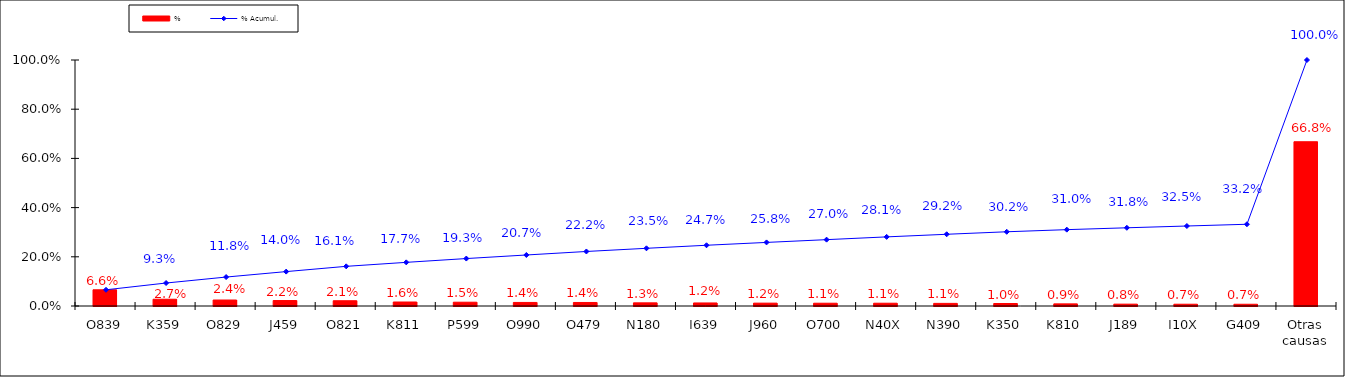
| Category | % |
|---|---|
| O839 | 0.066 |
| K359 | 0.027 |
| O829 | 0.024 |
| J459 | 0.022 |
| O821 | 0.021 |
| K811 | 0.016 |
| P599 | 0.015 |
| O990 | 0.014 |
| O479 | 0.014 |
| N180 | 0.013 |
| I639 | 0.012 |
| J960 | 0.012 |
| O700 | 0.011 |
| N40X | 0.011 |
| N390 | 0.011 |
| K350 | 0.01 |
| K810 | 0.009 |
| J189 | 0.008 |
| I10X | 0.007 |
| G409 | 0.007 |
| Otras causas | 0.668 |